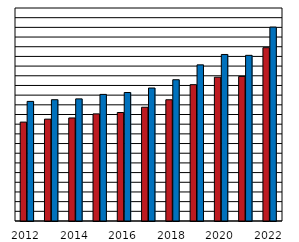
| Category | ženy  Women | muži  
Men |
|---|---|---|
| 2012.0 | 10215.288 | 12353.53 |
| 2013.0 | 10519.157 | 12528.285 |
| 2014.0 | 10643.295 | 12612.75 |
| 2015.0 | 11064 | 13076 |
| 2016.0 | 11205 | 13272 |
| 2017.0 | 11748 | 13737 |
| 2018.0 | 12523 | 14590 |
| 2019.0 | 14081 | 16126 |
| 2020.0 | 14853 | 17199 |
| 2021.0 | 14931 | 17111 |
| 2022.0 | 17902 | 20029 |